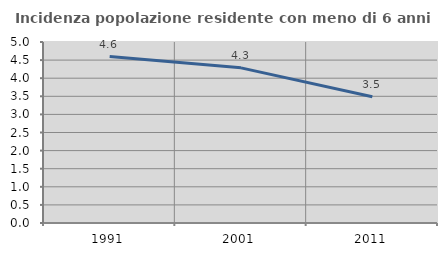
| Category | Incidenza popolazione residente con meno di 6 anni |
|---|---|
| 1991.0 | 4.598 |
| 2001.0 | 4.286 |
| 2011.0 | 3.488 |